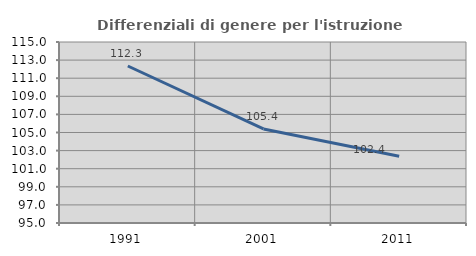
| Category | Differenziali di genere per l'istruzione superiore |
|---|---|
| 1991.0 | 112.349 |
| 2001.0 | 105.397 |
| 2011.0 | 102.382 |